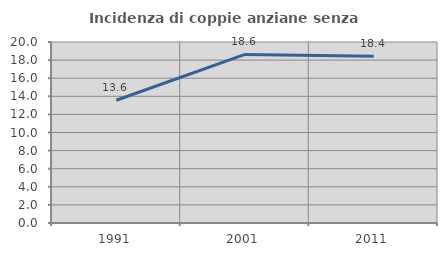
| Category | Incidenza di coppie anziane senza figli  |
|---|---|
| 1991.0 | 13.562 |
| 2001.0 | 18.632 |
| 2011.0 | 18.43 |